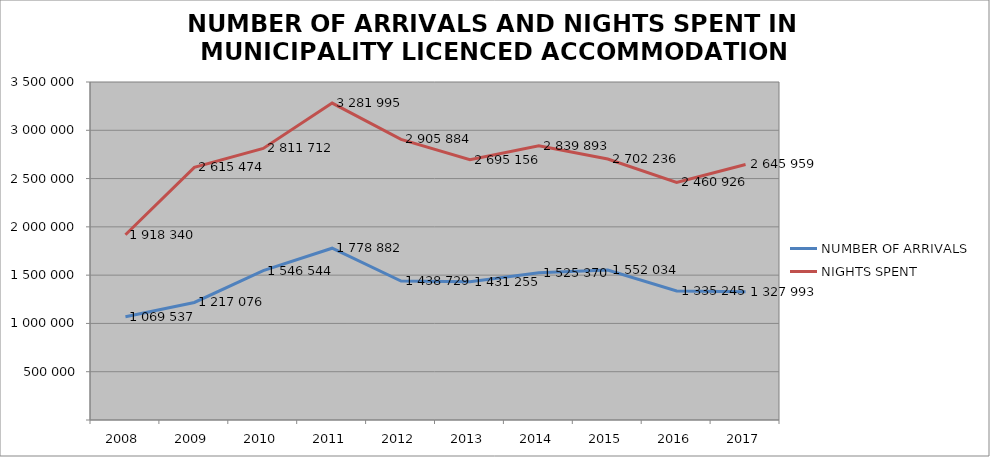
| Category | NUMBER OF ARRIVALS | NIGHTS SPENT |
|---|---|---|
| 2008 | 1069537 | 1918340 |
| 2009 | 1217076 | 2615474 |
| 2010 | 1546544 | 2811712 |
| 2011 | 1778882 | 3281995 |
| 2012 | 1438729 | 2905884 |
| 2013 | 1431255 | 2695156 |
| 2014 | 1525370 | 2839893 |
| 2015 | 1552034 | 2702236 |
| 2016 | 1335245 | 2460926 |
| 2017 | 1327993 | 2645959 |